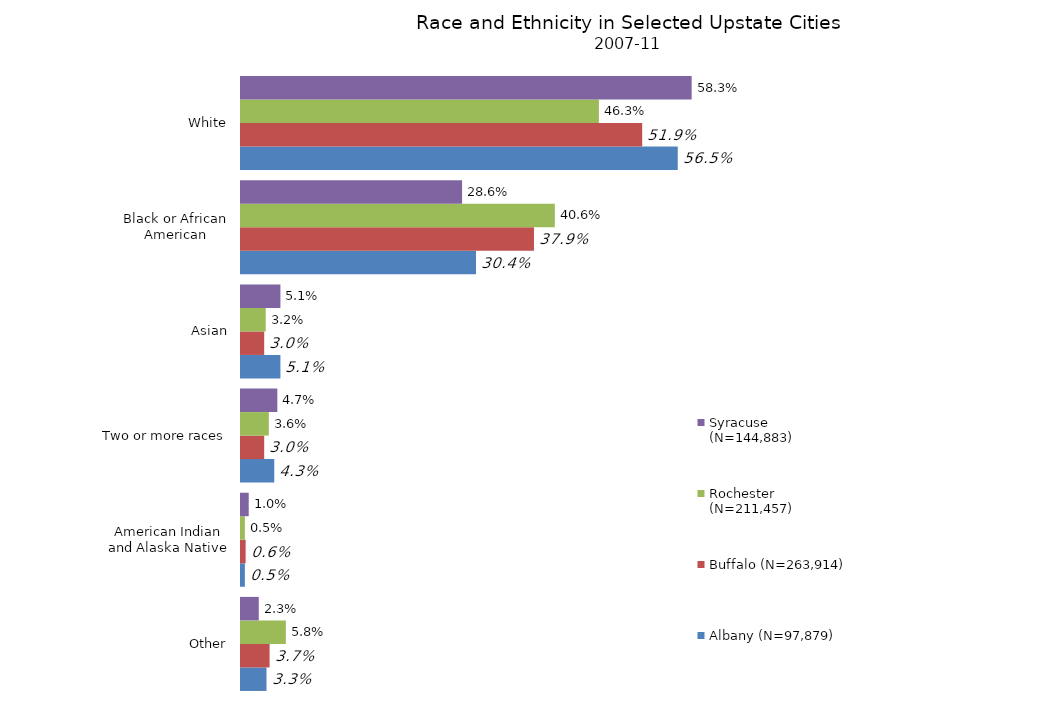
| Category | Albany (N=97,879) | Buffalo (N=263,914) | Rochester (N=211,457) | Syracuse (N=144,883) |
|---|---|---|---|---|
| Other | 0.033 | 0.037 | 0.058 | 0.023 |
| American Indian and Alaska Native | 0.005 | 0.006 | 0.005 | 0.01 |
| Two or more races | 0.043 | 0.03 | 0.036 | 0.047 |
| Asian | 0.051 | 0.03 | 0.032 | 0.051 |
| Black or African American | 0.304 | 0.379 | 0.406 | 0.286 |
| White | 0.565 | 0.519 | 0.463 | 0.583 |